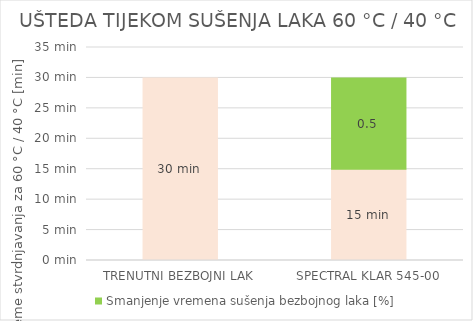
| Category | Vrijeme stvrdnjavanja za 60 °C / 40 °C [min] | Smanjenje vremena sušenja bezbojnog laka [%] |
|---|---|---|
| TRENUTNI BEZBOJNI LAK | 30 | 0 |
| SPECTRAL KLAR 545-00 | 15 | 15 |